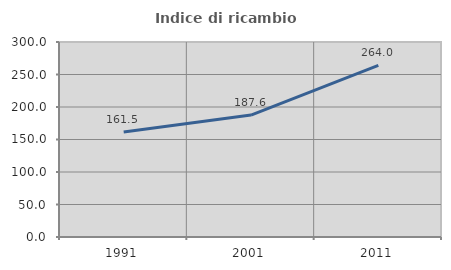
| Category | Indice di ricambio occupazionale  |
|---|---|
| 1991.0 | 161.491 |
| 2001.0 | 187.562 |
| 2011.0 | 264 |